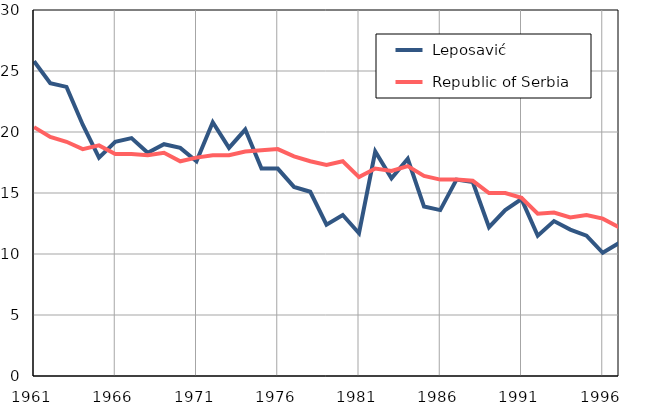
| Category |  Leposavić |  Republic of Serbia |
|---|---|---|
| 1961.0 | 25.8 | 20.4 |
| 1962.0 | 24 | 19.6 |
| 1963.0 | 23.7 | 19.2 |
| 1964.0 | 20.6 | 18.6 |
| 1965.0 | 17.9 | 18.9 |
| 1966.0 | 19.2 | 18.2 |
| 1967.0 | 19.5 | 18.2 |
| 1968.0 | 18.3 | 18.1 |
| 1969.0 | 19 | 18.3 |
| 1970.0 | 18.7 | 17.6 |
| 1971.0 | 17.6 | 17.9 |
| 1972.0 | 20.8 | 18.1 |
| 1973.0 | 18.7 | 18.1 |
| 1974.0 | 20.2 | 18.4 |
| 1975.0 | 17 | 18.5 |
| 1976.0 | 17 | 18.6 |
| 1977.0 | 15.5 | 18 |
| 1978.0 | 15.1 | 17.6 |
| 1979.0 | 12.4 | 17.3 |
| 1980.0 | 13.2 | 17.6 |
| 1981.0 | 11.7 | 16.3 |
| 1982.0 | 18.4 | 17 |
| 1983.0 | 16.2 | 16.8 |
| 1984.0 | 17.8 | 17.2 |
| 1985.0 | 13.9 | 16.4 |
| 1986.0 | 13.6 | 16.1 |
| 1987.0 | 16.1 | 16.1 |
| 1988.0 | 15.9 | 16 |
| 1989.0 | 12.2 | 15 |
| 1990.0 | 13.6 | 15 |
| 1991.0 | 14.5 | 14.6 |
| 1992.0 | 11.5 | 13.3 |
| 1993.0 | 12.7 | 13.4 |
| 1994.0 | 12 | 13 |
| 1995.0 | 11.5 | 13.2 |
| 1996.0 | 10.1 | 12.9 |
| 1997.0 | 10.9 | 12.2 |